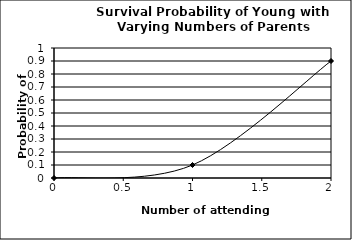
| Category | Series 0 |
|---|---|
| 0 | 0 |
| 1 | 0.1 |
| 2 | 0.9 |